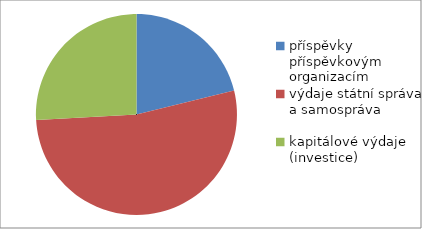
| Category | Series 0 |
|---|---|
| příspěvky příspěvkovým organizacím | 43929 |
| výdaje státní správa a samospráva | 110026.7 |
| kapitálové výdaje (investice) | 53700 |